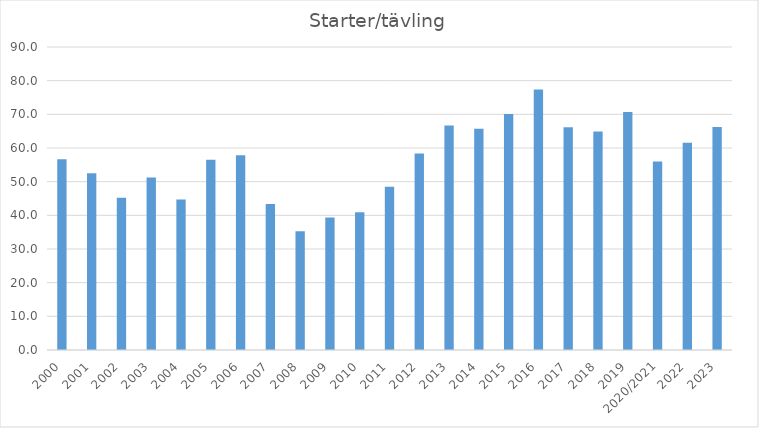
| Category | Starter/tävling |
|---|---|
| 2000 | 56.625 |
| 2001 | 52.5 |
| 2002 | 45.2 |
| 2003 | 51.222 |
| 2004 | 44.667 |
| 2005 | 56.5 |
| 2006 | 57.875 |
| 2007 | 43.375 |
| 2008 | 35.25 |
| 2009 | 39.333 |
| 2010 | 40.889 |
| 2011 | 48.5 |
| 2012 | 58.333 |
| 2013 | 66.667 |
| 2014 | 65.7 |
| 2015 | 70.1 |
| 2016 | 77.4 |
| 2017 | 66.2 |
| 2018 | 64.889 |
| 2019 | 70.667 |
| 2020/2021 | 56 |
| 2022 | 61.556 |
| 2023 | 66.222 |